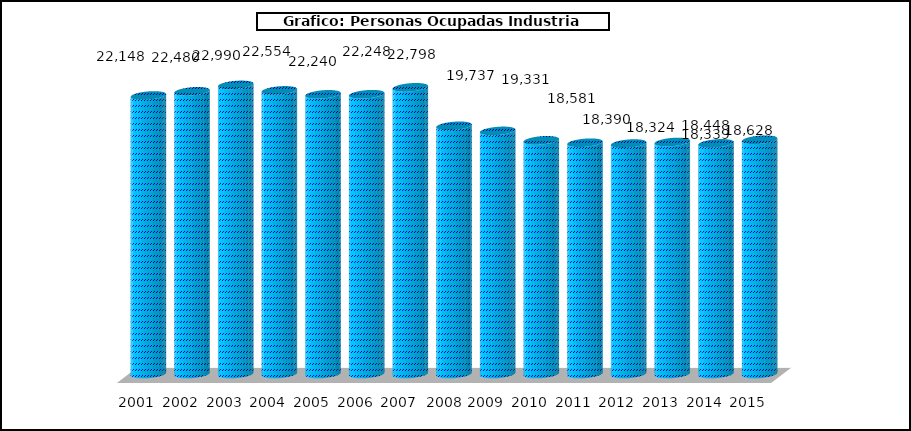
| Category |  Personas Ocupadas Industria Pesquera |
|---|---|
| 2001 | 22148 |
| 2002 | 22480 |
| 2003 | 22990 |
| 2004 | 22554 |
| 2005 | 22240 |
| 2006 | 22248 |
| 2007 | 22798 |
| 2008 * | 19737 |
| 2009 | 19331 |
| 2010 | 18581 |
| 2011 | 18390 |
| 2012 | 18324 |
| 2013 | 18448 |
| 2014 | 18339 |
| 2015 | 18628 |